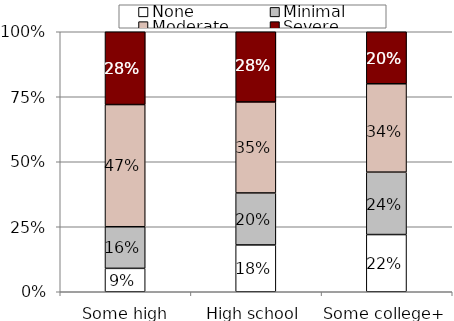
| Category | None | Minimal | Moderate | Severe |
|---|---|---|---|---|
| Some high school | 0.09 | 0.16 | 0.47 | 0.28 |
| High school | 0.18 | 0.2 | 0.35 | 0.28 |
| Some college+ | 0.22 | 0.24 | 0.34 | 0.2 |